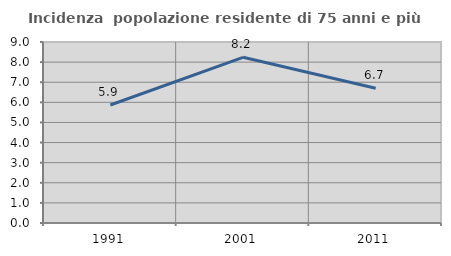
| Category | Incidenza  popolazione residente di 75 anni e più |
|---|---|
| 1991.0 | 5.867 |
| 2001.0 | 8.239 |
| 2011.0 | 6.701 |